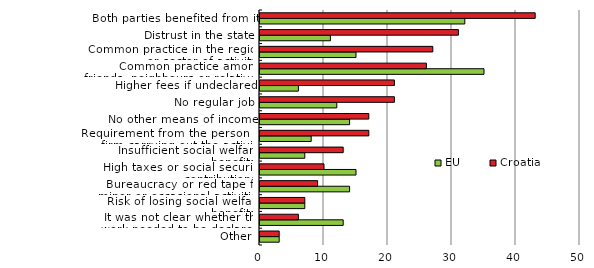
| Category | EU | Croatia |
|---|---|---|
| Other | 3 | 3 |
| It was not clear whether the work needed to be declared  | 13 | 6 |
| Risk of losing social welfare benefits | 7 | 7 |
| Bureaucracy or red tape for minor or occasional activities | 14 | 9 |
| High taxes or social security contributions | 15 | 10 |
| Insufficient social welfare benefits | 7 | 13 |
| Requirement from the person or firm carrying out the activity | 8 | 17 |
| No other means of income | 14 | 17 |
| No regular job | 12 | 21 |
| Higher fees if undeclared | 6 | 21 |
| Common practice among friends, neighbours or relatives  | 35 | 26 |
| Common practice in the region or sector of activity  | 15 | 27 |
| Distrust in the state | 11 | 31 |
| Both parties benefited from it | 32 | 43 |